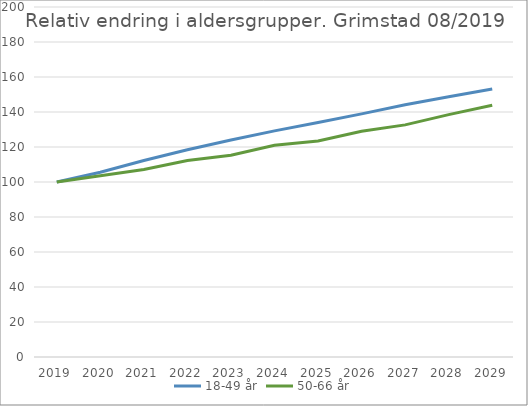
| Category | 18-49 år | 50-66 år |
|---|---|---|
| 2019 | 100 | 100 |
| 2020 | 105.615 | 103.626 |
| 2021 | 112.284 | 107.096 |
| 2022 | 118.437 | 112.276 |
| 2023 | 124.033 | 115.269 |
| 2024 | 129.206 | 120.967 |
| 2025 | 133.945 | 123.448 |
| 2026 | 138.931 | 128.961 |
| 2027 | 144.127 | 132.652 |
| 2028 | 148.692 | 138.485 |
| 2029 | 153.153 | 143.892 |